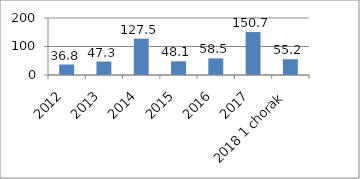
| Category | Series 0 |
|---|---|
| 2012 | 36.8 |
| 2013 | 47.3 |
| 2014 | 127.5 |
| 2015 | 48.1 |
| 2016 | 58.5 |
| 2017 | 150.7 |
| 2018 1 chorak | 55.2 |